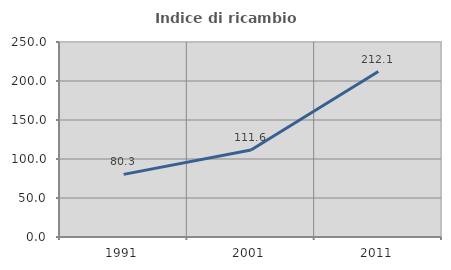
| Category | Indice di ricambio occupazionale  |
|---|---|
| 1991.0 | 80.258 |
| 2001.0 | 111.574 |
| 2011.0 | 212.086 |